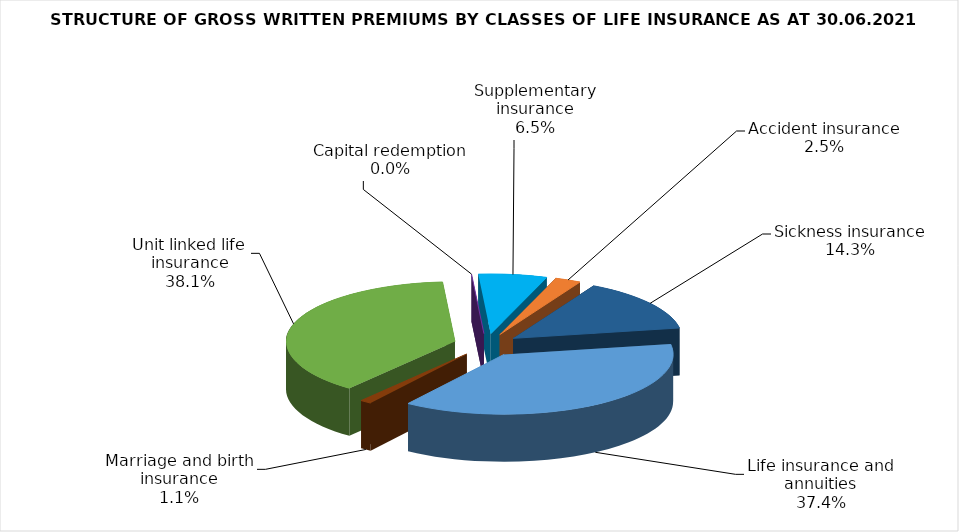
| Category | Life insurance and annuities |
|---|---|
| Life insurance and annuities | 110837858.198 |
| Marriage and birth insurance | 3299618.328 |
| Unit linked life insurance | 112850316.796 |
| Capital redemption | 0 |
| Supplementary insurance | 19406820.367 |
| Accident insurance | 7420634.693 |
| Sickness insurance | 42494899.662 |